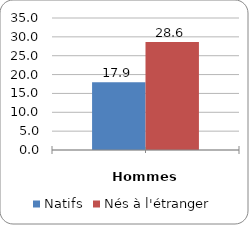
| Category | Natifs | Nés à l'étranger |
|---|---|---|
|  | 17.938 | 28.606 |